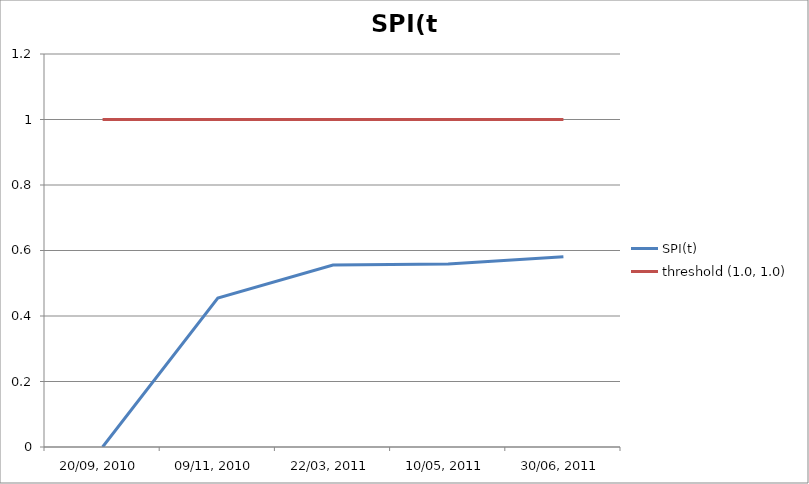
| Category | SPI(t) | threshold (1.0, 1.0) |
|---|---|---|
| 20/09, 2010 | 0 | 1 |
| 09/11, 2010 | 0.455 | 1 |
| 22/03, 2011 | 0.556 | 1 |
| 10/05, 2011 | 0.559 | 1 |
| 30/06, 2011 | 0.581 | 1 |